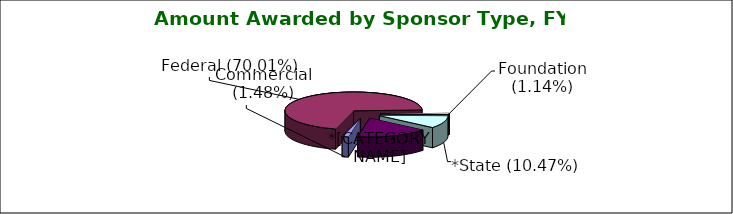
| Category | Series 0 |
|---|---|
| Commercial (1.48%) | 0.015 |
| Federal (70.01%) | 0.7 |
| Foundation (1.14%) | 0.011 |
| *State (10.47%) | 0.105 |
| Other (16.9%) | 0.169 |